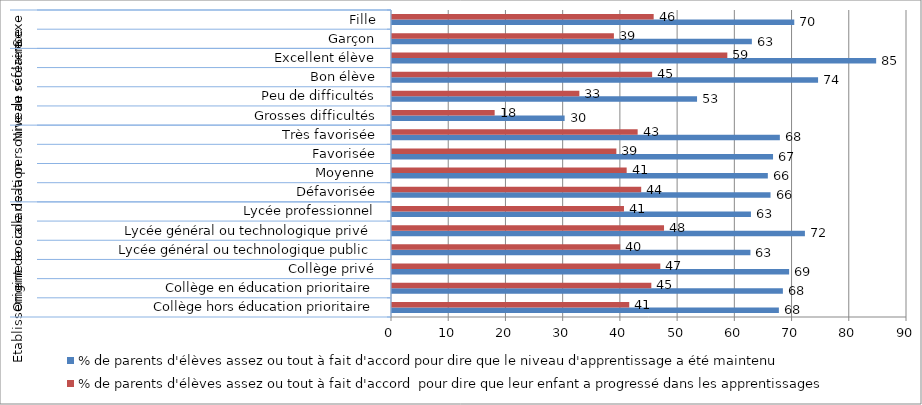
| Category | % de parents d'élèves assez ou tout à fait d'accord pour dire que le niveau d'apprentissage a été maintenu | % de parents d'élèves assez ou tout à fait d'accord  pour dire que leur enfant a progressé dans les apprentissages  |
|---|---|---|
| 0 | 67.61 | 41.46 |
| 1 | 68.31 | 45.32 |
| 2 | 69.4 | 46.89 |
| 3 | 62.64 | 39.88 |
| 4 | 72.16 | 47.54 |
| 5 | 62.73 | 40.54 |
| 6 | 66.15 | 43.55 |
| 7 | 65.68 | 41.01 |
| 8 | 66.59 | 39.21 |
| 9 | 67.78 | 42.93 |
| 10 | 30.17 | 17.94 |
| 11 | 53.31 | 32.74 |
| 12 | 74.46 | 45.46 |
| 13 | 84.61 | 58.6 |
| 14 | 62.89 | 38.78 |
| 15 | 70.3 | 45.73 |